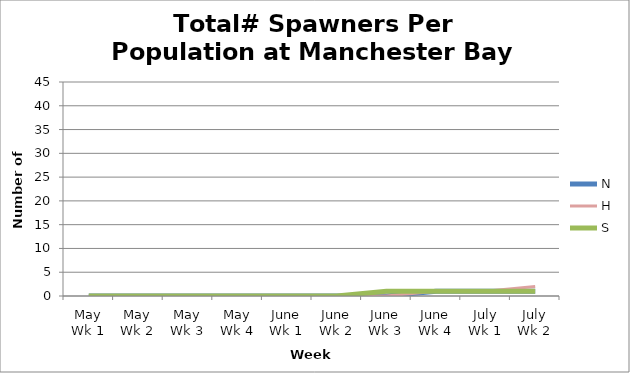
| Category | N | H | S |
|---|---|---|---|
| May Wk 1 | 0 | 0 | 0 |
| May Wk 2 | 0 | 0 | 0 |
| May Wk 3 | 0 | 0 | 0 |
| May Wk 4 | 0 | 0 | 0 |
| June Wk 1 | 0 | 0 | 0 |
| June Wk 2 | 0 | 0 | 0 |
| June Wk 3 | 0 | 0 | 1 |
| June Wk 4 | 1 | 1 | 1 |
| July Wk 1 | 1 | 1 | 1 |
| July Wk 2 | 1 | 2 | 1 |